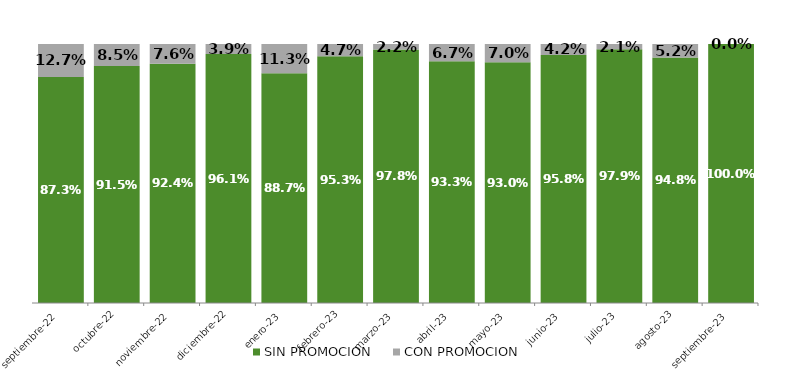
| Category | SIN PROMOCION   | CON PROMOCION   |
|---|---|---|
| 2022-09-01 | 0.873 | 0.127 |
| 2022-10-01 | 0.915 | 0.085 |
| 2022-11-01 | 0.924 | 0.076 |
| 2022-12-01 | 0.961 | 0.039 |
| 2023-01-01 | 0.887 | 0.113 |
| 2023-02-01 | 0.953 | 0.047 |
| 2023-03-01 | 0.978 | 0.022 |
| 2023-04-01 | 0.933 | 0.067 |
| 2023-05-01 | 0.93 | 0.07 |
| 2023-06-01 | 0.958 | 0.042 |
| 2023-07-01 | 0.979 | 0.021 |
| 2023-08-01 | 0.948 | 0.052 |
| 2023-09-01 | 1 | 0 |